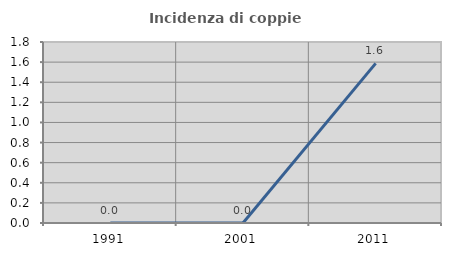
| Category | Incidenza di coppie miste |
|---|---|
| 1991.0 | 0 |
| 2001.0 | 0 |
| 2011.0 | 1.587 |